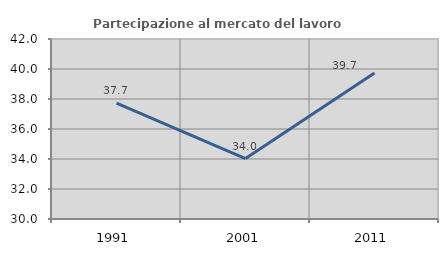
| Category | Partecipazione al mercato del lavoro  femminile |
|---|---|
| 1991.0 | 37.727 |
| 2001.0 | 34.032 |
| 2011.0 | 39.738 |